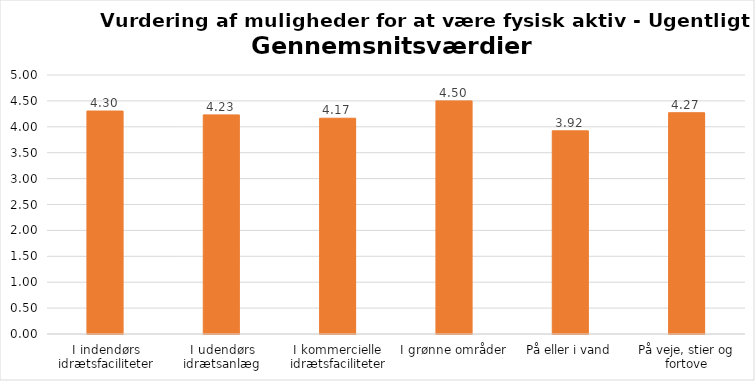
| Category | Gennemsnit |
|---|---|
| I indendørs idrætsfaciliteter | 4.305 |
| I udendørs idrætsanlæg | 4.23 |
| I kommercielle idrætsfaciliteter | 4.166 |
| I grønne områder | 4.5 |
| På eller i vand | 3.922 |
| På veje, stier og fortove | 4.272 |